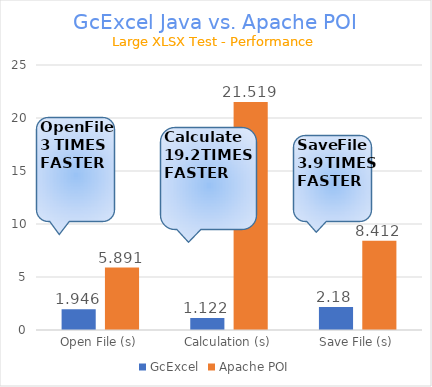
| Category | GcExcel | Apache POI |
|---|---|---|
| Open File (s) | 1.946 | 5.891 |
| Calculation (s) | 1.122 | 21.519 |
| Save File (s) | 2.18 | 8.412 |